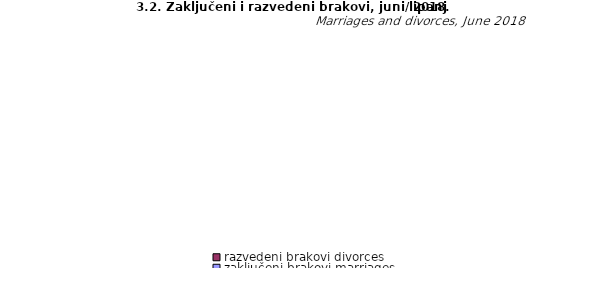
| Category | zaključeni brakovi marriages | razvedeni brakovi divorces |
|---|---|---|
| Unsko - sanski | 129 | 20 |
| Kanton Posavski | 9 | 1 |
| Tuzlanski | 179 | 14 |
| Zeničko - dobojski | 185 | 13 |
| Bosansko - podrinjski | 5 | 5 |
| Srednjobosanski | 112 | 6 |
| Hercegovačko-
neretvanski | 104 | 3 |
| Zapadnohercegovački | 45 | 2 |
| Kanton Sarajevo | 166 | 13 |
| Kanton 10 | 23 | 2 |